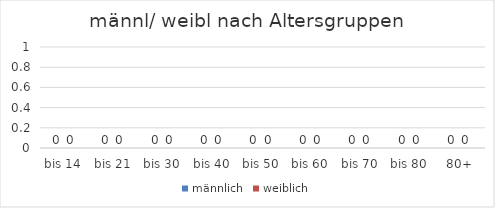
| Category | männlich | weiblich |
|---|---|---|
| bis 14 | 0 | 0 |
| bis 21 | 0 | 0 |
| bis 30 | 0 | 0 |
| bis 40 | 0 | 0 |
| bis 50 | 0 | 0 |
| bis 60 | 0 | 0 |
| bis 70 | 0 | 0 |
| bis 80 | 0 | 0 |
| 80+ | 0 | 0 |